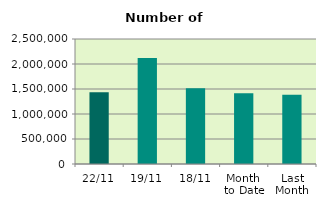
| Category | Series 0 |
|---|---|
| 22/11 | 1436634 |
| 19/11 | 2121122 |
| 18/11 | 1515576 |
| Month 
to Date | 1414042.625 |
| Last
Month | 1383348.571 |